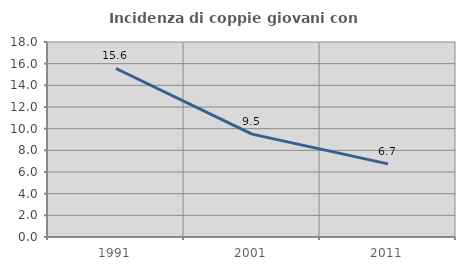
| Category | Incidenza di coppie giovani con figli |
|---|---|
| 1991.0 | 15.556 |
| 2001.0 | 9.497 |
| 2011.0 | 6.748 |